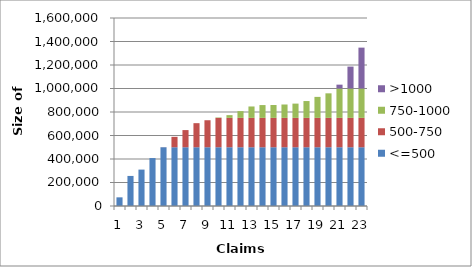
| Category | <=500 | 500-750 | 750-1000 | >1000 |
|---|---|---|---|---|
| 0 | 73677.5 | 0 | 0 | 0 |
| 1 | 255872.5 | 0 | 0 | 0 |
| 2 | 309790 | 0 | 0 | 0 |
| 3 | 408070 | 0 | 0 | 0 |
| 4 | 500000 | 532.5 | 0 | 0 |
| 5 | 500000 | 88575 | 0 | 0 |
| 6 | 500000 | 146130 | 0 | 0 |
| 7 | 500000 | 204957.5 | 0 | 0 |
| 8 | 500000 | 229917.5 | 0 | 0 |
| 9 | 500000 | 250000 | 3460 | 0 |
| 10 | 500000 | 250000 | 23370 | 0 |
| 11 | 500000 | 250000 | 57430 | 0 |
| 12 | 500000 | 250000 | 97015 | 0 |
| 13 | 500000 | 250000 | 108975 | 0 |
| 14 | 500000 | 250000 | 109657.5 | 0 |
| 15 | 500000 | 250000 | 113850 | 0 |
| 16 | 500000 | 250000 | 121390 | 0 |
| 17 | 500000 | 250000 | 143262.5 | 0 |
| 18 | 500000 | 250000 | 178687.5 | 0 |
| 19 | 500000 | 250000 | 208912.5 | 0 |
| 20 | 500000 | 250000 | 250000 | 32752.5 |
| 21 | 500000 | 250000 | 250000 | 186445 |
| 22 | 500000 | 250000 | 250000 | 347872.5 |